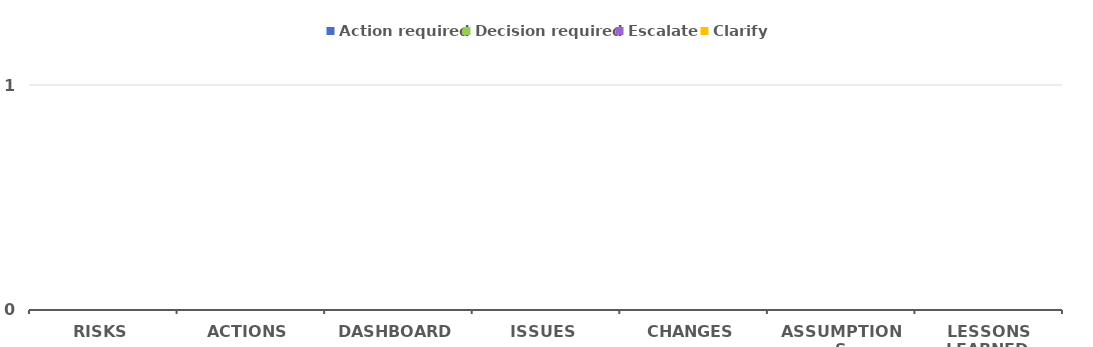
| Category | Action required | Decision required | Escalate | Clarify |
|---|---|---|---|---|
| RISKS | 0 | 0 | 0 | 0 |
| ACTIONS | 0 | 0 | 0 | 0 |
| DASHBOARD | 0 | 0 | 0 | 0 |
| ISSUES | 0 | 0 | 0 | 0 |
| CHANGES | 0 | 0 | 0 | 0 |
| ASSUMPTIONS | 0 | 0 | 0 | 0 |
| LESSONS LEARNED | 0 | 0 | 0 | 0 |